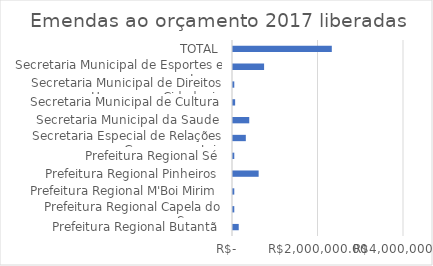
| Category | Series 0 |
|---|---|
| Prefeitura Regional Butantã | 134000 |
| Prefeitura Regional Capela do Socorro | 30000 |
| Prefeitura Regional M'Boi Mirim | 30000 |
| Prefeitura Regional Pinheiros | 600000 |
| Prefeitura Regional Sé | 30000 |
| Secretaria Especial de Relações Governamentais | 300000 |
| Secretaria Municipal da Saude | 380000 |
| Secretaria Municipal de Cultura | 50000 |
| Secretaria Municipal de Direitos Humanos e Cidadania | 30000 |
| Secretaria Municipal de Esportes e Lazer | 727271 |
| TOTAL | 2311271 |